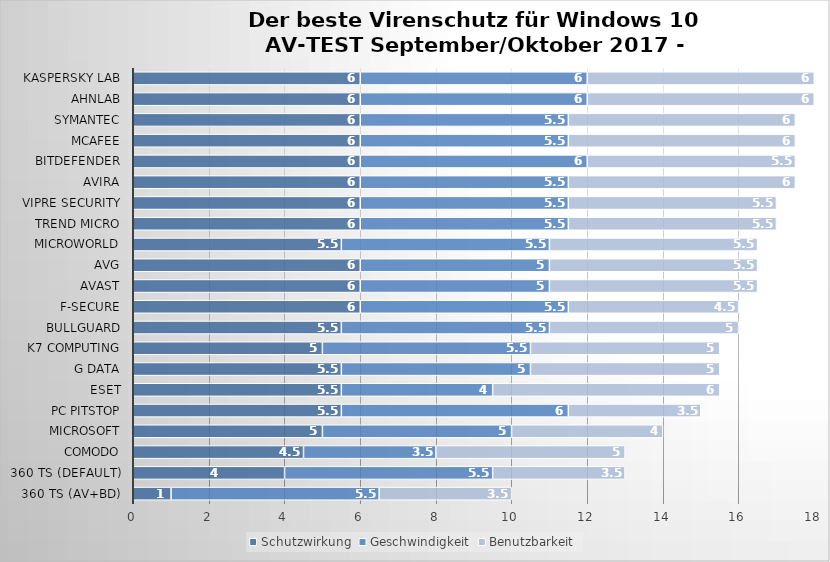
| Category | Schutzwirkung | Geschwindigkeit | Benutzbarkeit |
|---|---|---|---|
| 360 TS (AV+BD) | 1 | 5.5 | 3.5 |
| 360 TS (Default) | 4 | 5.5 | 3.5 |
| Comodo | 4.5 | 3.5 | 5 |
| Microsoft | 5 | 5 | 4 |
| PC Pitstop | 5.5 | 6 | 3.5 |
| ESET | 5.5 | 4 | 6 |
| G Data | 5.5 | 5 | 5 |
| K7 Computing | 5 | 5.5 | 5 |
| BullGuard | 5.5 | 5.5 | 5 |
| F-Secure | 6 | 5.5 | 4.5 |
| Avast | 6 | 5 | 5.5 |
| AVG | 6 | 5 | 5.5 |
| Microworld | 5.5 | 5.5 | 5.5 |
| Trend Micro | 6 | 5.5 | 5.5 |
| VIPRE Security | 6 | 5.5 | 5.5 |
| Avira | 6 | 5.5 | 6 |
| Bitdefender | 6 | 6 | 5.5 |
| McAfee | 6 | 5.5 | 6 |
| Symantec | 6 | 5.5 | 6 |
| AhnLab | 6 | 6 | 6 |
| Kaspersky Lab | 6 | 6 | 6 |